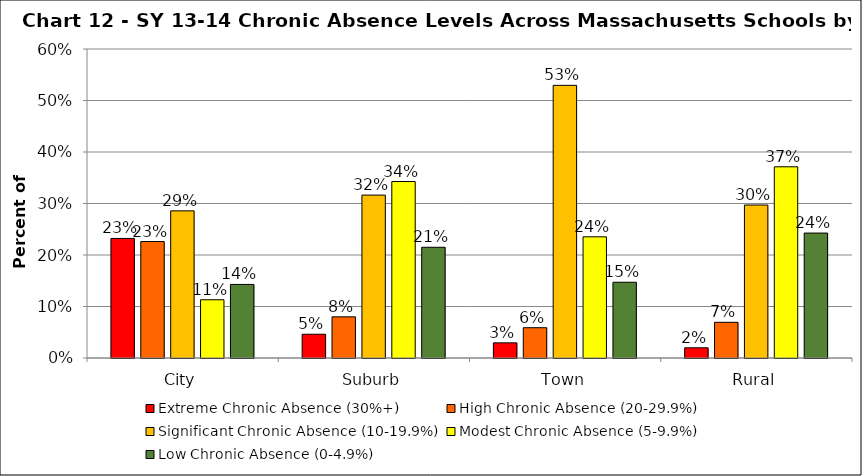
| Category | Extreme Chronic Absence (30%+) | High Chronic Absence (20-29.9%) | Significant Chronic Absence (10-19.9%) | Modest Chronic Absence (5-9.9%) | Low Chronic Absence (0-4.9%) |
|---|---|---|---|---|---|
| 0 | 0.232 | 0.226 | 0.286 | 0.113 | 0.143 |
| 1 | 0.046 | 0.08 | 0.316 | 0.343 | 0.215 |
| 2 | 0.029 | 0.059 | 0.529 | 0.235 | 0.147 |
| 3 | 0.02 | 0.069 | 0.297 | 0.371 | 0.243 |